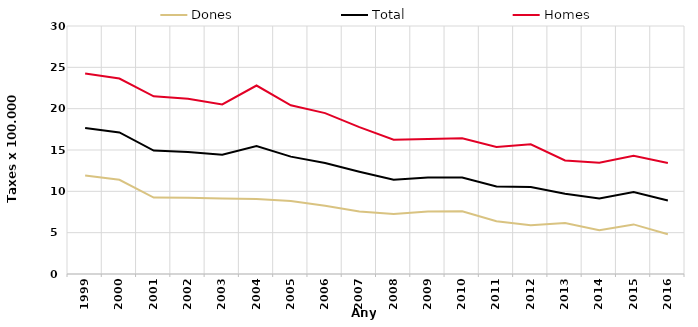
| Category | Dones | Total | Homes |
|---|---|---|---|
| 1999.0 | 11.92 | 17.66 | 24.26 |
| 2000.0 | 11.39 | 17.12 | 23.65 |
| 2001.0 | 9.25 | 14.93 | 21.5 |
| 2002.0 | 9.23 | 14.77 | 21.19 |
| 2003.0 | 9.12 | 14.44 | 20.52 |
| 2004.0 | 9.07 | 15.47 | 22.8 |
| 2005.0 | 8.84 | 14.2 | 20.41 |
| 2006.0 | 8.25 | 13.43 | 19.46 |
| 2007.0 | 7.57 | 12.37 | 17.77 |
| 2008.0 | 7.26 | 11.4 | 16.25 |
| 2009.0 | 7.56 | 11.67 | 16.32 |
| 2010.0 | 7.59 | 11.68 | 16.41 |
| 2011.0 | 6.38 | 10.58 | 15.36 |
| 2012.0 | 5.91 | 10.52 | 15.69 |
| 2013.0 | 6.18 | 9.71 | 13.74 |
| 2014.0 | 5.29 | 9.13 | 13.47 |
| 2015.0 | 6 | 9.91 | 14.29 |
| 2016.0 | 4.8 | 8.89 | 13.43 |